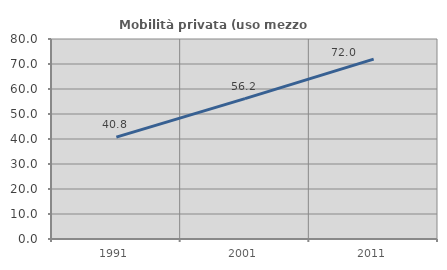
| Category | Mobilità privata (uso mezzo privato) |
|---|---|
| 1991.0 | 40.759 |
| 2001.0 | 56.166 |
| 2011.0 | 71.952 |